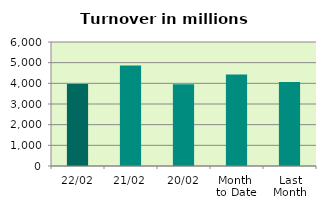
| Category | Series 0 |
|---|---|
| 22/02 | 3972.825 |
| 21/02 | 4867.75 |
| 20/02 | 3955.613 |
| Month 
to Date | 4429.629 |
| Last
Month | 4067.116 |